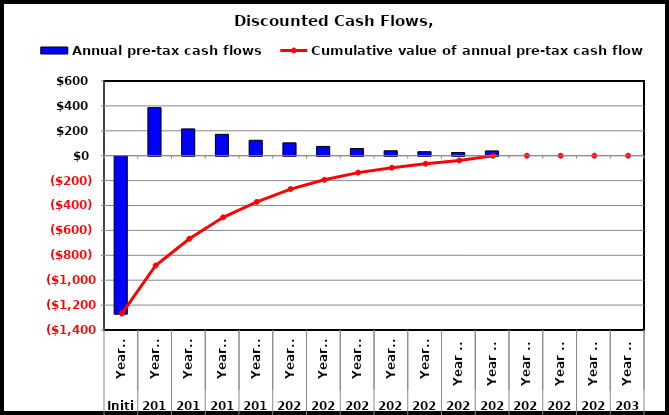
| Category | Annual pre-tax cash flows |
|---|---|
| 0 | -1268.12 |
| 1 | 386.115 |
| 2 | 215.275 |
| 3 | 171.617 |
| 4 | 123.924 |
| 5 | 103.27 |
| 6 | 74.447 |
| 7 | 57.529 |
| 8 | 39.562 |
| 9 | 32.13 |
| 10 | 25.842 |
| 11 | 38.406 |
| 12 | 0 |
| 13 | 0 |
| 14 | 0 |
| 15 | 0 |